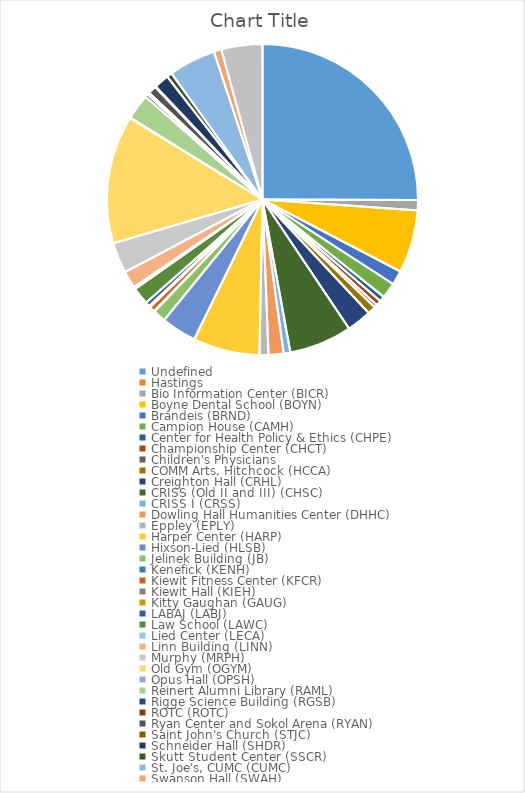
| Category | Series 0 |
|---|---|
| Undefined | 322 |
| Hastings  | 0 |
| Bio Information Center (BICR) | 14 |
| Boyne Dental School (BOYN) | 84 |
| Brandeis (BRND) | 19 |
| Campion House (CAMH) | 21 |
| Center for Health Policy & Ethics (CHPE) | 7 |
| Championship Center (CHCT) | 7 |
| Children's Physicians | 4 |
| COMM Arts, Hitchcock (HCCA) | 11 |
| Creighton Hall (CRHL) | 33 |
| CRISS (Old II and III) (CHSC) | 84 |
| CRISS I (CRSS) | 9 |
| Dowling Hall Humanities Center (DHHC) | 20 |
| Eppley (EPLY) | 12 |
| Harper Center (HARP) | 89 |
| Hixson-Lied (HLSB) | 47 |
| Jelinek Building (JB) | 17 |
| Kenefick (KENH) | 1 |
| Kiewit Fitness Center (KFCR) | 7 |
| Kiewit Hall (KIEH) | 1 |
| Kitty Gaughan (GAUG) | 1 |
| LABAJ (LABJ) | 6 |
| Law School (LAWC) | 23 |
| Lied Center (LECA) | 3 |
| Linn Building (LINN) | 23 |
| Murphy (MRPH) | 41 |
| Old Gym (OGYM) | 171 |
| Opus Hall (OPSH) | 1 |
| Reinert Alumni Library (RAML) | 34 |
| Rigge Science Building (RGSB) | 4 |
| ROTC (ROTC) | 3 |
| Ryan Center and Sokol Arena (RYAN) | 11 |
| Saint John's Church (STJC) | 1 |
| Schneider Hall (SHDR) | 20 |
| Skutt Student Center (SSCR) | 7 |
| St. Joe's, CUMC (CUMC) | 63 |
| Swanson Hall (SWAH) | 10 |
| Wareham Building (WARE) | 55 |